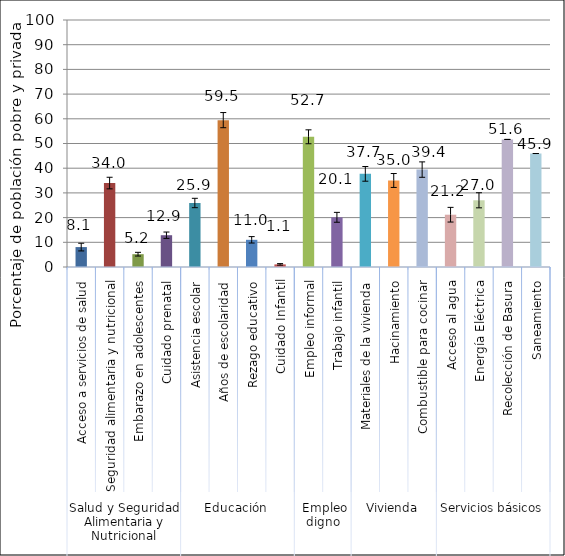
| Category | Series 0 |
|---|---|
| 0 | 8.062 |
| 1 | 33.987 |
| 2 | 5.187 |
| 3 | 12.868 |
| 4 | 25.914 |
| 5 | 59.46 |
| 6 | 11.007 |
| 7 | 1.058 |
| 8 | 52.716 |
| 9 | 20.12 |
| 10 | 37.711 |
| 11 | 35.03 |
| 12 | 39.437 |
| 13 | 21.173 |
| 14 | 27.01 |
| 15 | 51.649 |
| 16 | 45.944 |